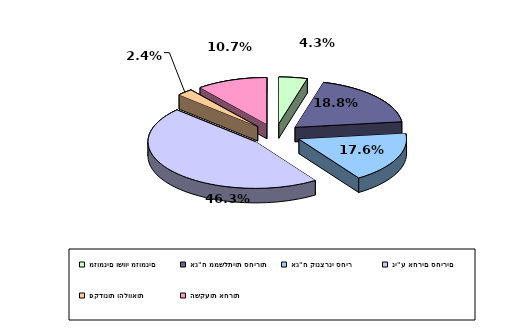
| Category | Series 0 |
|---|---|
| מזומנים ושווי מזומנים | 0.043 |
| אג"ח ממשלתיות סחירות | 0.188 |
| אג"ח קונצרני סחיר | 0.176 |
| ני"ע אחרים סחירים | 0.463 |
| פקדונות והלוואות | 0.024 |
| השקעות אחרות | 0.107 |